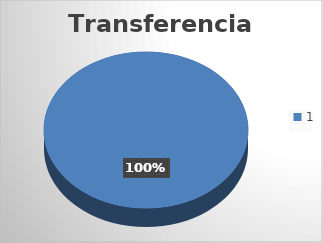
| Category | Transferencias: |
|---|---|
| 0 | 10 |